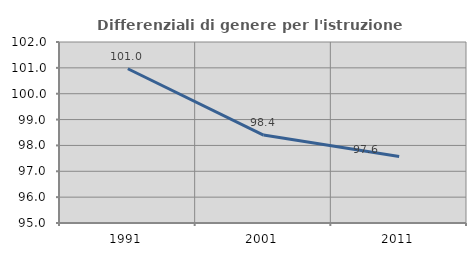
| Category | Differenziali di genere per l'istruzione superiore |
|---|---|
| 1991.0 | 100.966 |
| 2001.0 | 98.4 |
| 2011.0 | 97.568 |